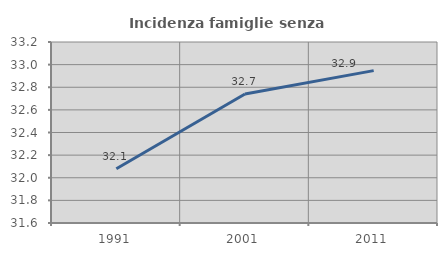
| Category | Incidenza famiglie senza nuclei |
|---|---|
| 1991.0 | 32.079 |
| 2001.0 | 32.74 |
| 2011.0 | 32.947 |